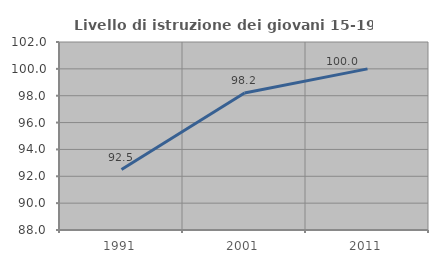
| Category | Livello di istruzione dei giovani 15-19 anni |
|---|---|
| 1991.0 | 92.5 |
| 2001.0 | 98.204 |
| 2011.0 | 100 |